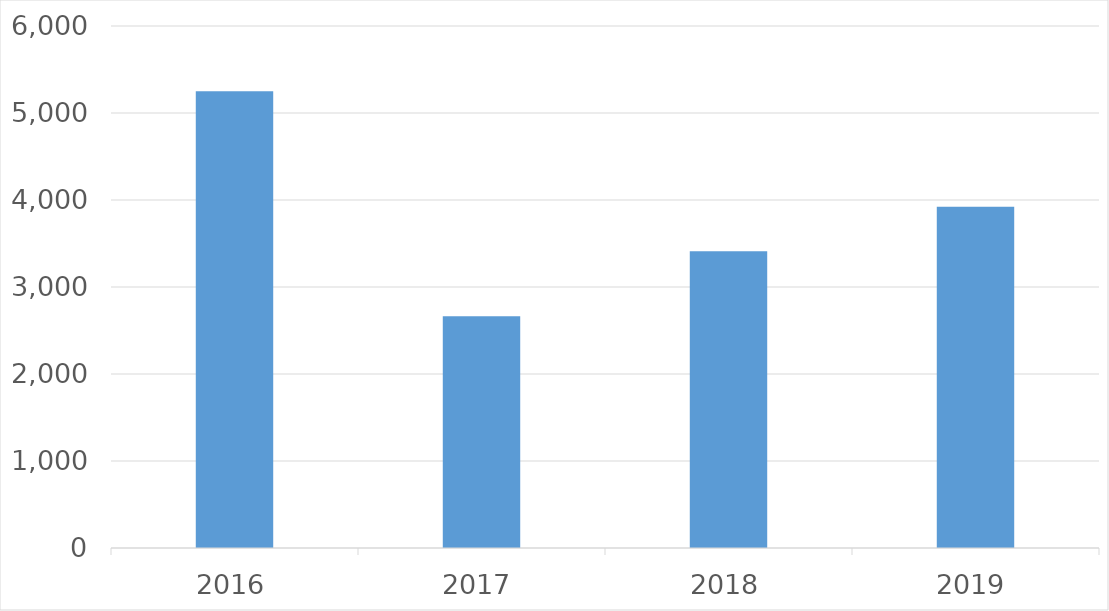
| Category | Series 0 |
|---|---|
| 2016 | 5249 |
| 2017 | 2664 |
| 2018 | 3410 |
| 2019 | 3923 |